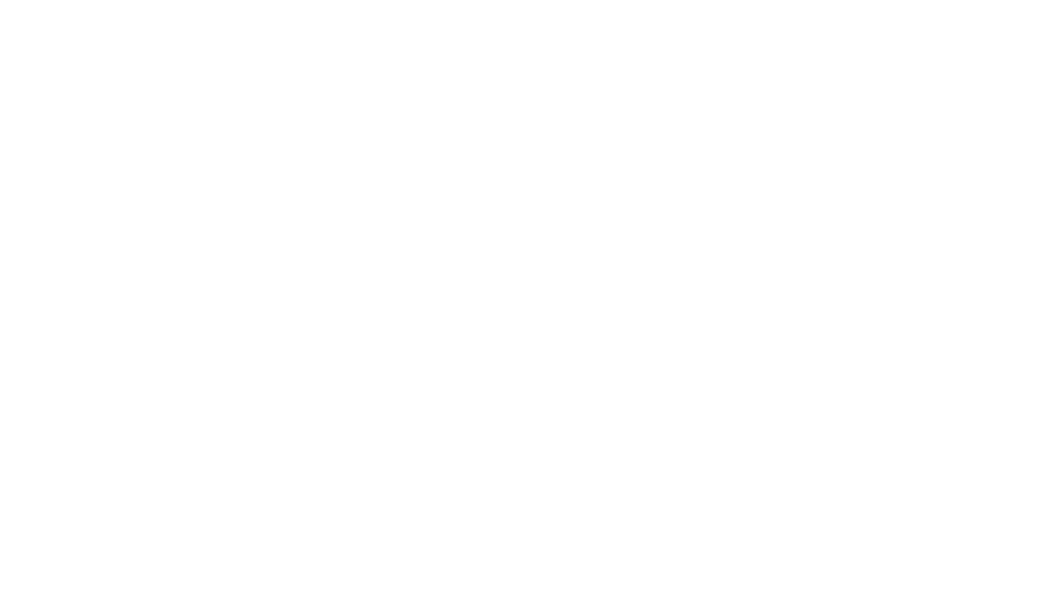
| Category | Series 0 |
|---|---|
| 0 | 17 |
| 1 | 18 |